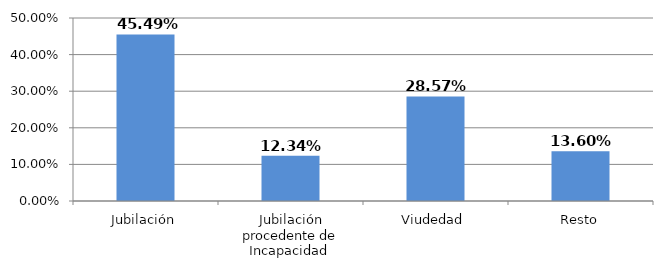
| Category | Series 0 |
|---|---|
| Jubilación | 0.455 |
| Jubilación procedente de Incapacidad  | 0.123 |
| Viudedad | 0.286 |
| Resto | 0.136 |